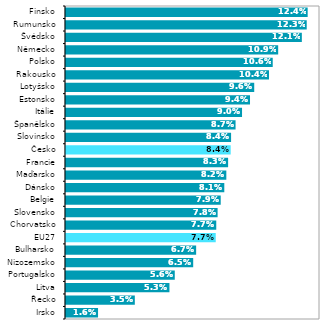
| Category | 2019* |
|---|---|
| Irsko | 0.016 |
| Řecko | 0.035 |
| Litva | 0.053 |
| Portugalsko | 0.056 |
| Nizozemsko | 0.065 |
| Bulharsko | 0.067 |
| EU27 | 0.077 |
| Chorvatsko | 0.077 |
| Slovensko | 0.078 |
| Belgie | 0.079 |
| Dánsko | 0.081 |
| Maďarsko | 0.082 |
| Francie | 0.083 |
| Česko | 0.084 |
| Slovinsko | 0.084 |
| Španělsko | 0.087 |
| Itálie | 0.09 |
| Estonsko | 0.094 |
| Lotyšsko | 0.096 |
| Rakousko | 0.104 |
| Polsko | 0.106 |
| Německo | 0.109 |
| Švédsko | 0.121 |
| Rumunsko | 0.123 |
| Finsko | 0.124 |